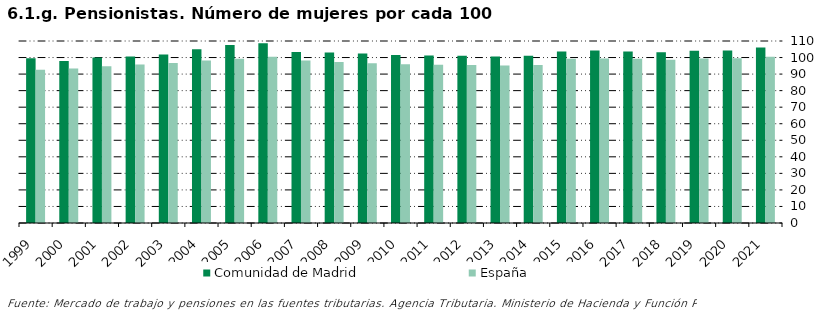
| Category | Comunidad de Madrid | España |
|---|---|---|
| 1999.0 | 99.523 | 92.65 |
| 2000.0 | 97.846 | 93.426 |
| 2001.0 | 99.992 | 94.773 |
| 2002.0 | 100.686 | 95.791 |
| 2003.0 | 101.766 | 96.649 |
| 2004.0 | 105.025 | 98.251 |
| 2005.0 | 107.516 | 99.313 |
| 2006.0 | 108.57 | 100.42 |
| 2007.0 | 103.367 | 98.253 |
| 2008.0 | 103.117 | 97.356 |
| 2009.0 | 102.384 | 96.525 |
| 2010.0 | 101.517 | 95.945 |
| 2011.0 | 101.244 | 95.71 |
| 2012.0 | 101.067 | 95.497 |
| 2013.0 | 100.634 | 95.182 |
| 2014.0 | 101.037 | 95.506 |
| 2015.0 | 103.596 | 99.331 |
| 2016.0 | 104.189 | 99.483 |
| 2017.0 | 103.612 | 99.234 |
| 2018.0 | 103.235 | 98.703 |
| 2019.0 | 104.09 | 99.44 |
| 2020.0 | 104.201 | 99.528 |
| 2021.0 | 106.146 | 100.434 |